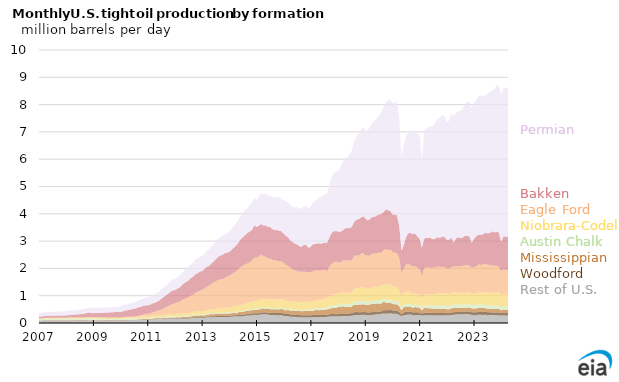
| Category | Rest of U.S. L48 | Woodford | Mississippian | Austin Chalk | Niobrara-Codell | Eagle Ford | Bakken | Permian |
|---|---|---|---|---|---|---|---|---|
| 2007-01-01 | 0.094 | 0.001 | 0.013 | 0.04 | 0.028 | 0 | 0.067 | 0.132 |
| 2007-02-01 | 0.077 | 0.001 | 0.016 | 0.042 | 0.03 | 0 | 0.067 | 0.137 |
| 2007-03-01 | 0.093 | 0.001 | 0.015 | 0.041 | 0.035 | 0 | 0.069 | 0.137 |
| 2007-04-01 | 0.098 | 0.001 | 0.016 | 0.043 | 0.037 | 0 | 0.069 | 0.139 |
| 2007-05-01 | 0.098 | 0.001 | 0.016 | 0.043 | 0.038 | 0 | 0.074 | 0.137 |
| 2007-06-01 | 0.097 | 0.001 | 0.015 | 0.042 | 0.036 | 0 | 0.073 | 0.136 |
| 2007-07-01 | 0.097 | 0.001 | 0.016 | 0.041 | 0.037 | 0 | 0.075 | 0.14 |
| 2007-08-01 | 0.097 | 0.001 | 0.017 | 0.042 | 0.038 | 0 | 0.075 | 0.143 |
| 2007-09-01 | 0.098 | 0.001 | 0.016 | 0.04 | 0.037 | 0 | 0.077 | 0.143 |
| 2007-10-01 | 0.099 | 0.001 | 0.016 | 0.04 | 0.039 | 0 | 0.081 | 0.146 |
| 2007-11-01 | 0.099 | 0.001 | 0.016 | 0.042 | 0.039 | 0 | 0.08 | 0.15 |
| 2007-12-01 | 0.099 | 0.001 | 0.013 | 0.041 | 0.037 | 0 | 0.085 | 0.154 |
| 2008-01-01 | 0.098 | 0.002 | 0.017 | 0.042 | 0.036 | 0 | 0.086 | 0.154 |
| 2008-02-01 | 0.098 | 0.001 | 0.017 | 0.041 | 0.041 | 0 | 0.085 | 0.159 |
| 2008-03-01 | 0.099 | 0.001 | 0.019 | 0.045 | 0.043 | 0 | 0.091 | 0.161 |
| 2008-04-01 | 0.097 | 0.002 | 0.018 | 0.043 | 0.044 | 0 | 0.098 | 0.16 |
| 2008-05-01 | 0.097 | 0.002 | 0.018 | 0.042 | 0.044 | 0 | 0.106 | 0.16 |
| 2008-06-01 | 0.095 | 0.002 | 0.017 | 0.043 | 0.045 | 0.001 | 0.116 | 0.162 |
| 2008-07-01 | 0.096 | 0.002 | 0.016 | 0.043 | 0.044 | 0 | 0.121 | 0.168 |
| 2008-08-01 | 0.096 | 0.003 | 0.016 | 0.043 | 0.045 | 0 | 0.127 | 0.171 |
| 2008-09-01 | 0.093 | 0.003 | 0.016 | 0.039 | 0.05 | 0.001 | 0.14 | 0.164 |
| 2008-10-01 | 0.098 | 0.003 | 0.016 | 0.044 | 0.049 | 0.001 | 0.156 | 0.182 |
| 2008-11-01 | 0.101 | 0.004 | 0.017 | 0.044 | 0.05 | 0.001 | 0.168 | 0.19 |
| 2008-12-01 | 0.1 | 0.003 | 0.018 | 0.043 | 0.047 | 0.001 | 0.157 | 0.192 |
| 2009-01-01 | 0.101 | 0.003 | 0.018 | 0.042 | 0.048 | 0.001 | 0.145 | 0.193 |
| 2009-02-01 | 0.1 | 0.004 | 0.019 | 0.041 | 0.049 | 0.001 | 0.15 | 0.195 |
| 2009-03-01 | 0.097 | 0.004 | 0.018 | 0.039 | 0.05 | 0.001 | 0.155 | 0.194 |
| 2009-04-01 | 0.097 | 0.004 | 0.019 | 0.039 | 0.046 | 0.002 | 0.157 | 0.192 |
| 2009-05-01 | 0.095 | 0.004 | 0.019 | 0.038 | 0.047 | 0.002 | 0.165 | 0.188 |
| 2009-06-01 | 0.094 | 0.004 | 0.019 | 0.036 | 0.047 | 0.001 | 0.173 | 0.183 |
| 2009-07-01 | 0.093 | 0.004 | 0.018 | 0.035 | 0.046 | 0.002 | 0.186 | 0.181 |
| 2009-08-01 | 0.092 | 0.004 | 0.017 | 0.034 | 0.047 | 0.002 | 0.189 | 0.184 |
| 2009-09-01 | 0.095 | 0.004 | 0.017 | 0.035 | 0.048 | 0.003 | 0.195 | 0.187 |
| 2009-10-01 | 0.092 | 0.003 | 0.016 | 0.034 | 0.046 | 0.005 | 0.198 | 0.191 |
| 2009-11-01 | 0.095 | 0.003 | 0.017 | 0.035 | 0.049 | 0.007 | 0.202 | 0.198 |
| 2009-12-01 | 0.089 | 0.004 | 0.015 | 0.036 | 0.046 | 0.007 | 0.2 | 0.201 |
| 2010-01-01 | 0.091 | 0.004 | 0.015 | 0.036 | 0.05 | 0.008 | 0.201 | 0.206 |
| 2010-02-01 | 0.093 | 0.005 | 0.016 | 0.036 | 0.051 | 0.007 | 0.22 | 0.214 |
| 2010-03-01 | 0.101 | 0.005 | 0.017 | 0.036 | 0.052 | 0.012 | 0.236 | 0.217 |
| 2010-04-01 | 0.1 | 0.005 | 0.018 | 0.035 | 0.051 | 0.016 | 0.243 | 0.219 |
| 2010-05-01 | 0.097 | 0.006 | 0.017 | 0.036 | 0.052 | 0.02 | 0.259 | 0.228 |
| 2010-06-01 | 0.096 | 0.006 | 0.017 | 0.036 | 0.05 | 0.027 | 0.275 | 0.231 |
| 2010-07-01 | 0.099 | 0.006 | 0.017 | 0.036 | 0.046 | 0.032 | 0.283 | 0.238 |
| 2010-08-01 | 0.105 | 0.006 | 0.018 | 0.036 | 0.054 | 0.035 | 0.291 | 0.244 |
| 2010-09-01 | 0.112 | 0.006 | 0.017 | 0.036 | 0.055 | 0.044 | 0.306 | 0.25 |
| 2010-10-01 | 0.116 | 0.007 | 0.018 | 0.037 | 0.055 | 0.051 | 0.306 | 0.261 |
| 2010-11-01 | 0.119 | 0.008 | 0.02 | 0.039 | 0.058 | 0.066 | 0.321 | 0.272 |
| 2010-12-01 | 0.12 | 0.008 | 0.019 | 0.038 | 0.062 | 0.087 | 0.309 | 0.28 |
| 2011-01-01 | 0.122 | 0.008 | 0.02 | 0.037 | 0.058 | 0.093 | 0.308 | 0.291 |
| 2011-02-01 | 0.122 | 0.008 | 0.017 | 0.037 | 0.059 | 0.105 | 0.316 | 0.27 |
| 2011-03-01 | 0.133 | 0.008 | 0.023 | 0.04 | 0.065 | 0.122 | 0.327 | 0.301 |
| 2011-04-01 | 0.139 | 0.011 | 0.022 | 0.039 | 0.068 | 0.135 | 0.32 | 0.306 |
| 2011-05-01 | 0.146 | 0.012 | 0.023 | 0.039 | 0.066 | 0.159 | 0.334 | 0.315 |
| 2011-06-01 | 0.143 | 0.012 | 0.022 | 0.038 | 0.07 | 0.178 | 0.355 | 0.321 |
| 2011-07-01 | 0.142 | 0.011 | 0.024 | 0.036 | 0.069 | 0.21 | 0.396 | 0.334 |
| 2011-08-01 | 0.149 | 0.011 | 0.025 | 0.037 | 0.073 | 0.242 | 0.414 | 0.344 |
| 2011-09-01 | 0.148 | 0.013 | 0.028 | 0.038 | 0.076 | 0.275 | 0.433 | 0.358 |
| 2011-10-01 | 0.156 | 0.014 | 0.029 | 0.039 | 0.078 | 0.299 | 0.46 | 0.372 |
| 2011-11-01 | 0.156 | 0.014 | 0.03 | 0.041 | 0.082 | 0.339 | 0.481 | 0.391 |
| 2011-12-01 | 0.158 | 0.017 | 0.029 | 0.04 | 0.08 | 0.364 | 0.506 | 0.396 |
| 2012-01-01 | 0.156 | 0.017 | 0.032 | 0.039 | 0.083 | 0.393 | 0.484 | 0.407 |
| 2012-02-01 | 0.162 | 0.018 | 0.035 | 0.039 | 0.086 | 0.417 | 0.496 | 0.422 |
| 2012-03-01 | 0.154 | 0.017 | 0.035 | 0.037 | 0.089 | 0.443 | 0.517 | 0.434 |
| 2012-04-01 | 0.16 | 0.017 | 0.038 | 0.038 | 0.085 | 0.49 | 0.549 | 0.453 |
| 2012-05-01 | 0.165 | 0.019 | 0.044 | 0.037 | 0.095 | 0.522 | 0.58 | 0.461 |
| 2012-06-01 | 0.168 | 0.018 | 0.043 | 0.037 | 0.09 | 0.547 | 0.6 | 0.472 |
| 2012-07-01 | 0.169 | 0.023 | 0.044 | 0.035 | 0.094 | 0.583 | 0.613 | 0.488 |
| 2012-08-01 | 0.172 | 0.022 | 0.048 | 0.036 | 0.096 | 0.628 | 0.639 | 0.5 |
| 2012-09-01 | 0.182 | 0.024 | 0.051 | 0.036 | 0.104 | 0.634 | 0.664 | 0.517 |
| 2012-10-01 | 0.191 | 0.025 | 0.058 | 0.036 | 0.117 | 0.677 | 0.686 | 0.535 |
| 2012-11-01 | 0.194 | 0.022 | 0.061 | 0.036 | 0.123 | 0.709 | 0.674 | 0.547 |
| 2012-12-01 | 0.191 | 0.023 | 0.065 | 0.036 | 0.126 | 0.744 | 0.705 | 0.55 |
| 2013-01-01 | 0.19 | 0.028 | 0.067 | 0.037 | 0.121 | 0.779 | 0.676 | 0.554 |
| 2013-02-01 | 0.192 | 0.027 | 0.054 | 0.037 | 0.128 | 0.822 | 0.719 | 0.568 |
| 2013-03-01 | 0.207 | 0.031 | 0.066 | 0.036 | 0.129 | 0.863 | 0.724 | 0.572 |
| 2013-04-01 | 0.209 | 0.033 | 0.075 | 0.034 | 0.132 | 0.878 | 0.729 | 0.6 |
| 2013-05-01 | 0.214 | 0.034 | 0.079 | 0.036 | 0.131 | 0.936 | 0.748 | 0.622 |
| 2013-06-01 | 0.213 | 0.033 | 0.077 | 0.036 | 0.134 | 0.989 | 0.761 | 0.628 |
| 2013-07-01 | 0.214 | 0.036 | 0.078 | 0.036 | 0.144 | 1.019 | 0.811 | 0.64 |
| 2013-08-01 | 0.221 | 0.039 | 0.082 | 0.035 | 0.153 | 1.04 | 0.849 | 0.658 |
| 2013-09-01 | 0.22 | 0.041 | 0.082 | 0.035 | 0.154 | 1.067 | 0.872 | 0.684 |
| 2013-10-01 | 0.218 | 0.043 | 0.083 | 0.034 | 0.172 | 1.059 | 0.882 | 0.695 |
| 2013-11-01 | 0.224 | 0.04 | 0.089 | 0.034 | 0.179 | 1.081 | 0.916 | 0.678 |
| 2013-12-01 | 0.221 | 0.038 | 0.085 | 0.035 | 0.173 | 1.146 | 0.874 | 0.712 |
| 2014-01-01 | 0.224 | 0.039 | 0.088 | 0.034 | 0.173 | 1.17 | 0.88 | 0.738 |
| 2014-02-01 | 0.229 | 0.044 | 0.085 | 0.034 | 0.18 | 1.212 | 0.893 | 0.76 |
| 2014-03-01 | 0.238 | 0.043 | 0.096 | 0.032 | 0.198 | 1.236 | 0.916 | 0.79 |
| 2014-04-01 | 0.241 | 0.042 | 0.068 | 0.034 | 0.204 | 1.304 | 0.942 | 0.814 |
| 2014-05-01 | 0.247 | 0.049 | 0.101 | 0.034 | 0.222 | 1.312 | 0.978 | 0.834 |
| 2014-06-01 | 0.251 | 0.049 | 0.102 | 0.033 | 0.231 | 1.377 | 1.03 | 0.844 |
| 2014-07-01 | 0.245 | 0.052 | 0.105 | 0.034 | 0.237 | 1.418 | 1.053 | 0.89 |
| 2014-08-01 | 0.261 | 0.051 | 0.123 | 0.035 | 0.251 | 1.433 | 1.07 | 0.924 |
| 2014-09-01 | 0.279 | 0.057 | 0.114 | 0.038 | 0.252 | 1.438 | 1.122 | 0.916 |
| 2014-10-01 | 0.278 | 0.061 | 0.119 | 0.037 | 0.264 | 1.468 | 1.121 | 0.979 |
| 2014-11-01 | 0.282 | 0.065 | 0.123 | 0.037 | 0.269 | 1.509 | 1.127 | 1.019 |
| 2014-12-01 | 0.299 | 0.06 | 0.127 | 0.039 | 0.284 | 1.595 | 1.166 | 1.027 |
| 2015-01-01 | 0.293 | 0.062 | 0.125 | 0.039 | 0.291 | 1.582 | 1.13 | 0.981 |
| 2015-02-01 | 0.3 | 0.059 | 0.134 | 0.045 | 0.299 | 1.605 | 1.12 | 1.048 |
| 2015-03-01 | 0.312 | 0.068 | 0.147 | 0.044 | 0.304 | 1.622 | 1.131 | 1.115 |
| 2015-04-01 | 0.319 | 0.073 | 0.144 | 0.045 | 0.309 | 1.572 | 1.112 | 1.154 |
| 2015-05-01 | 0.319 | 0.069 | 0.146 | 0.043 | 0.309 | 1.542 | 1.145 | 1.162 |
| 2015-06-01 | 0.31 | 0.069 | 0.145 | 0.043 | 0.306 | 1.498 | 1.155 | 1.154 |
| 2015-07-01 | 0.295 | 0.076 | 0.136 | 0.041 | 0.315 | 1.499 | 1.152 | 1.14 |
| 2015-08-01 | 0.292 | 0.072 | 0.142 | 0.04 | 0.32 | 1.444 | 1.133 | 1.186 |
| 2015-09-01 | 0.289 | 0.077 | 0.139 | 0.039 | 0.318 | 1.43 | 1.108 | 1.2 |
| 2015-10-01 | 0.285 | 0.077 | 0.141 | 0.042 | 0.319 | 1.426 | 1.118 | 1.203 |
| 2015-11-01 | 0.282 | 0.081 | 0.133 | 0.047 | 0.316 | 1.389 | 1.126 | 1.24 |
| 2015-12-01 | 0.289 | 0.088 | 0.143 | 0.047 | 0.305 | 1.394 | 1.098 | 1.16 |
| 2016-01-01 | 0.258 | 0.091 | 0.146 | 0.044 | 0.307 | 1.362 | 1.068 | 1.226 |
| 2016-02-01 | 0.256 | 0.07 | 0.137 | 0.044 | 0.3 | 1.314 | 1.067 | 1.261 |
| 2016-03-01 | 0.252 | 0.084 | 0.144 | 0.041 | 0.291 | 1.27 | 1.059 | 1.281 |
| 2016-04-01 | 0.232 | 0.076 | 0.14 | 0.042 | 0.292 | 1.237 | 0.99 | 1.293 |
| 2016-05-01 | 0.232 | 0.082 | 0.148 | 0.041 | 0.286 | 1.184 | 0.996 | 1.304 |
| 2016-06-01 | 0.224 | 0.078 | 0.152 | 0.042 | 0.281 | 1.151 | 0.976 | 1.32 |
| 2016-07-01 | 0.215 | 0.077 | 0.146 | 0.041 | 0.29 | 1.128 | 0.979 | 1.356 |
| 2016-08-01 | 0.214 | 0.075 | 0.152 | 0.04 | 0.292 | 1.107 | 0.933 | 1.387 |
| 2016-09-01 | 0.21 | 0.073 | 0.15 | 0.046 | 0.292 | 1.106 | 0.922 | 1.385 |
| 2016-10-01 | 0.206 | 0.074 | 0.157 | 0.046 | 0.292 | 1.099 | 0.993 | 1.414 |
| 2016-11-01 | 0.21 | 0.074 | 0.16 | 0.055 | 0.288 | 1.086 | 0.983 | 1.422 |
| 2016-12-01 | 0.204 | 0.076 | 0.155 | 0.052 | 0.282 | 1.091 | 0.896 | 1.44 |
| 2017-01-01 | 0.208 | 0.076 | 0.151 | 0.056 | 0.275 | 1.094 | 0.936 | 1.463 |
| 2017-02-01 | 0.214 | 0.08 | 0.163 | 0.057 | 0.272 | 1.113 | 0.983 | 1.555 |
| 2017-03-01 | 0.221 | 0.083 | 0.167 | 0.062 | 0.285 | 1.105 | 0.974 | 1.581 |
| 2017-04-01 | 0.222 | 0.08 | 0.171 | 0.072 | 0.3 | 1.077 | 0.998 | 1.614 |
| 2017-05-01 | 0.221 | 0.077 | 0.17 | 0.079 | 0.307 | 1.074 | 0.986 | 1.701 |
| 2017-06-01 | 0.221 | 0.077 | 0.182 | 0.076 | 0.315 | 1.066 | 0.981 | 1.738 |
| 2017-07-01 | 0.219 | 0.072 | 0.193 | 0.067 | 0.33 | 1.075 | 0.997 | 1.768 |
| 2017-08-01 | 0.225 | 0.07 | 0.207 | 0.057 | 0.357 | 0.966 | 1.037 | 1.806 |
| 2017-09-01 | 0.237 | 0.079 | 0.201 | 0.071 | 0.379 | 1.075 | 1.056 | 1.899 |
| 2017-10-01 | 0.242 | 0.086 | 0.215 | 0.098 | 0.387 | 1.127 | 1.131 | 2.038 |
| 2017-11-01 | 0.247 | 0.084 | 0.226 | 0.091 | 0.399 | 1.167 | 1.142 | 2.125 |
| 2017-12-01 | 0.246 | 0.075 | 0.234 | 0.09 | 0.411 | 1.192 | 1.123 | 2.183 |
| 2018-01-01 | 0.244 | 0.081 | 0.26 | 0.088 | 0.408 | 1.149 | 1.124 | 2.194 |
| 2018-02-01 | 0.251 | 0.084 | 0.254 | 0.083 | 0.401 | 1.145 | 1.121 | 2.338 |
| 2018-03-01 | 0.26 | 0.091 | 0.263 | 0.102 | 0.411 | 1.157 | 1.107 | 2.494 |
| 2018-04-01 | 0.255 | 0.091 | 0.243 | 0.102 | 0.427 | 1.169 | 1.17 | 2.549 |
| 2018-05-01 | 0.261 | 0.089 | 0.246 | 0.099 | 0.424 | 1.169 | 1.191 | 2.572 |
| 2018-06-01 | 0.258 | 0.091 | 0.229 | 0.089 | 0.404 | 1.217 | 1.178 | 2.696 |
| 2018-07-01 | 0.267 | 0.098 | 0.234 | 0.102 | 0.416 | 1.182 | 1.221 | 2.779 |
| 2018-08-01 | 0.286 | 0.104 | 0.283 | 0.113 | 0.46 | 1.195 | 1.241 | 2.944 |
| 2018-09-01 | 0.297 | 0.109 | 0.257 | 0.122 | 0.479 | 1.22 | 1.304 | 3.019 |
| 2018-10-01 | 0.295 | 0.103 | 0.282 | 0.114 | 0.489 | 1.178 | 1.337 | 3.125 |
| 2018-11-01 | 0.293 | 0.101 | 0.281 | 0.121 | 0.509 | 1.225 | 1.324 | 3.207 |
| 2018-12-01 | 0.299 | 0.104 | 0.283 | 0.122 | 0.512 | 1.243 | 1.348 | 3.262 |
| 2019-01-01 | 0.297 | 0.101 | 0.277 | 0.114 | 0.495 | 1.207 | 1.348 | 3.237 |
| 2019-02-01 | 0.297 | 0.094 | 0.269 | 0.107 | 0.486 | 1.218 | 1.284 | 3.299 |
| 2019-03-01 | 0.285 | 0.101 | 0.291 | 0.101 | 0.474 | 1.212 | 1.341 | 3.352 |
| 2019-04-01 | 0.298 | 0.102 | 0.308 | 0.099 | 0.494 | 1.242 | 1.337 | 3.437 |
| 2019-05-01 | 0.306 | 0.101 | 0.301 | 0.109 | 0.502 | 1.228 | 1.339 | 3.528 |
| 2019-06-01 | 0.318 | 0.1 | 0.293 | 0.116 | 0.505 | 1.234 | 1.37 | 3.546 |
| 2019-07-01 | 0.321 | 0.094 | 0.298 | 0.117 | 0.513 | 1.234 | 1.391 | 3.619 |
| 2019-08-01 | 0.333 | 0.091 | 0.289 | 0.119 | 0.521 | 1.215 | 1.425 | 3.724 |
| 2019-09-01 | 0.348 | 0.121 | 0.305 | 0.117 | 0.518 | 1.252 | 1.39 | 3.815 |
| 2019-10-01 | 0.34 | 0.127 | 0.29 | 0.111 | 0.558 | 1.275 | 1.463 | 3.896 |
| 2019-11-01 | 0.35 | 0.12 | 0.266 | 0.109 | 0.565 | 1.262 | 1.462 | 4.037 |
| 2019-12-01 | 0.362 | 0.129 | 0.266 | 0.116 | 0.545 | 1.272 | 1.421 | 4.05 |
| 2020-01-01 | 0.34 | 0.117 | 0.24 | 0.113 | 0.529 | 1.264 | 1.376 | 4.082 |
| 2020-02-01 | 0.337 | 0.119 | 0.234 | 0.119 | 0.511 | 1.255 | 1.401 | 4.069 |
| 2020-03-01 | 0.333 | 0.121 | 0.234 | 0.121 | 0.5 | 1.253 | 1.381 | 4.169 |
| 2020-04-01 | 0.299 | 0.106 | 0.211 | 0.106 | 0.49 | 1.163 | 1.18 | 3.942 |
| 2020-05-01 | 0.253 | 0.059 | 0.154 | 0.088 | 0.435 | 0.827 | 0.83 | 3.395 |
| 2020-06-01 | 0.289 | 0.101 | 0.193 | 0.088 | 0.441 | 0.898 | 0.857 | 3.671 |
| 2020-07-01 | 0.298 | 0.106 | 0.204 | 0.089 | 0.453 | 0.99 | 1.002 | 3.715 |
| 2020-08-01 | 0.31 | 0.103 | 0.191 | 0.094 | 0.451 | 1.013 | 1.125 | 3.66 |
| 2020-09-01 | 0.316 | 0.107 | 0.177 | 0.089 | 0.427 | 1.005 | 1.178 | 3.668 |
| 2020-10-01 | 0.286 | 0.101 | 0.167 | 0.093 | 0.409 | 1.012 | 1.186 | 3.733 |
| 2020-11-01 | 0.286 | 0.104 | 0.196 | 0.097 | 0.403 | 1.006 | 1.181 | 3.758 |
| 2020-12-01 | 0.295 | 0.096 | 0.181 | 0.091 | 0.384 | 0.976 | 1.146 | 3.739 |
| 2021-01-01 | 0.288 | 0.093 | 0.177 | 0.089 | 0.382 | 0.955 | 1.104 | 3.81 |
| 2021-02-01 | 0.274 | 0.066 | 0.125 | 0.075 | 0.377 | 0.808 | 1.043 | 3.151 |
| 2021-03-01 | 0.286 | 0.089 | 0.171 | 0.099 | 0.374 | 0.996 | 1.066 | 3.979 |
| 2021-04-01 | 0.288 | 0.085 | 0.173 | 0.096 | 0.408 | 1.001 | 1.08 | 4 |
| 2021-05-01 | 0.282 | 0.087 | 0.172 | 0.106 | 0.413 | 0.974 | 1.088 | 4.077 |
| 2021-06-01 | 0.292 | 0.085 | 0.166 | 0.11 | 0.401 | 0.964 | 1.094 | 4.087 |
| 2021-07-01 | 0.28 | 0.084 | 0.159 | 0.111 | 0.407 | 0.983 | 1.039 | 4.164 |
| 2021-08-01 | 0.283 | 0.082 | 0.155 | 0.115 | 0.414 | 0.984 | 1.068 | 4.264 |
| 2021-09-01 | 0.285 | 0.091 | 0.159 | 0.119 | 0.429 | 0.989 | 1.072 | 4.338 |
| 2021-10-01 | 0.277 | 0.089 | 0.161 | 0.114 | 0.456 | 0.956 | 1.069 | 4.399 |
| 2021-11-01 | 0.284 | 0.086 | 0.155 | 0.118 | 0.451 | 0.96 | 1.121 | 4.43 |
| 2021-12-01 | 0.283 | 0.085 | 0.152 | 0.123 | 0.449 | 0.957 | 1.105 | 4.415 |
| 2022-01-01 | 0.279 | 0.082 | 0.145 | 0.124 | 0.431 | 0.94 | 1.052 | 4.304 |
| 2022-02-01 | 0.284 | 0.076 | 0.142 | 0.121 | 0.439 | 0.934 | 1.055 | 4.356 |
| 2022-03-01 | 0.295 | 0.09 | 0.156 | 0.119 | 0.447 | 0.94 | 1.088 | 4.55 |
| 2022-04-01 | 0.302 | 0.092 | 0.155 | 0.118 | 0.445 | 0.964 | 0.875 | 4.616 |
| 2022-05-01 | 0.315 | 0.09 | 0.156 | 0.119 | 0.436 | 0.951 | 1.021 | 4.606 |
| 2022-06-01 | 0.317 | 0.088 | 0.152 | 0.121 | 0.429 | 0.984 | 1.058 | 4.6 |
| 2022-07-01 | 0.319 | 0.085 | 0.147 | 0.123 | 0.429 | 0.972 | 1.032 | 4.653 |
| 2022-08-01 | 0.325 | 0.087 | 0.15 | 0.119 | 0.432 | 0.984 | 1.033 | 4.725 |
| 2022-09-01 | 0.327 | 0.086 | 0.144 | 0.115 | 0.43 | 1.007 | 1.083 | 4.848 |
| 2022-10-01 | 0.327 | 0.086 | 0.153 | 0.112 | 0.433 | 1.007 | 1.079 | 4.901 |
| 2022-11-01 | 0.319 | 0.099 | 0.153 | 0.113 | 0.444 | 0.979 | 1.061 | 4.931 |
| 2022-12-01 | 0.297 | 0.099 | 0.137 | 0.12 | 0.407 | 0.957 | 0.926 | 4.913 |
| 2023-01-01 | 0.286 | 0.102 | 0.143 | 0.128 | 0.421 | 0.974 | 1.026 | 5 |
| 2023-02-01 | 0.29 | 0.104 | 0.142 | 0.13 | 0.414 | 0.987 | 1.12 | 4.953 |
| 2023-03-01 | 0.308 | 0.109 | 0.144 | 0.126 | 0.432 | 1.028 | 1.086 | 5.094 |
| 2023-04-01 | 0.301 | 0.11 | 0.137 | 0.128 | 0.445 | 1.004 | 1.096 | 5.1 |
| 2023-05-01 | 0.295 | 0.118 | 0.138 | 0.126 | 0.452 | 1.029 | 1.1 | 5.083 |
| 2023-06-01 | 0.305 | 0.109 | 0.133 | 0.119 | 0.46 | 1.039 | 1.133 | 5.021 |
| 2023-07-01 | 0.285 | 0.108 | 0.132 | 0.123 | 0.454 | 1.038 | 1.145 | 5.105 |
| 2023-08-01 | 0.292 | 0.101 | 0.125 | 0.126 | 0.462 | 1.011 | 1.18 | 5.164 |
| 2023-09-01 | 0.29 | 0.096 | 0.123 | 0.13 | 0.456 | 1.009 | 1.259 | 5.166 |
| 2023-10-01 | 0.293 | 0.095 | 0.125 | 0.131 | 0.471 | 0.975 | 1.226 | 5.224 |
| 2023-11-01 | 0.29 | 0.094 | 0.128 | 0.127 | 0.482 | 0.978 | 1.252 | 5.373 |
| 2023-12-01 | 0.284 | 0.102 | 0.124 | 0.116 | 0.494 | 0.94 | 1.246 | 5.403 |
| 2024-01-01 | 0.27 | 0.089 | 0.11 | 0.106 | 0.422 | 0.892 | 1.078 | 5.387 |
| 2024-02-01 | 0.28 | 0.093 | 0.121 | 0.112 | 0.465 | 0.887 | 1.222 | 5.408 |
| 2024-03-01 | 0.274 | 0.093 | 0.119 | 0.112 | 0.465 | 0.884 | 1.22 | 5.447 |
| 2024-04-01 | 0.274 | 0.092 | 0.118 | 0.112 | 0.464 | 0.88 | 1.219 | 5.465 |
| 2024-05-01 | 0.273 | 0.092 | 0.116 | 0.112 | 0.464 | 0.876 | 1.218 | 5.483 |
| 2024-06-01 | 0 | 0 | 0 | 0 | 0 | 0 | 0 | 0 |
| 2024-07-01 | 0 | 0 | 0 | 0 | 0 | 0 | 0 | 0 |
| 2024-08-01 | 0 | 0 | 0 | 0 | 0 | 0 | 0 | 0 |
| 2024-09-01 | 0 | 0 | 0 | 0 | 0 | 0 | 0 | 0 |
| 2024-10-01 | 0 | 0 | 0 | 0 | 0 | 0 | 0 | 0 |
| 2024-11-01 | 0 | 0 | 0 | 0 | 0 | 0 | 0 | 0 |
| 2024-12-01 | 0 | 0 | 0 | 0 | 0 | 0 | 0 | 0 |